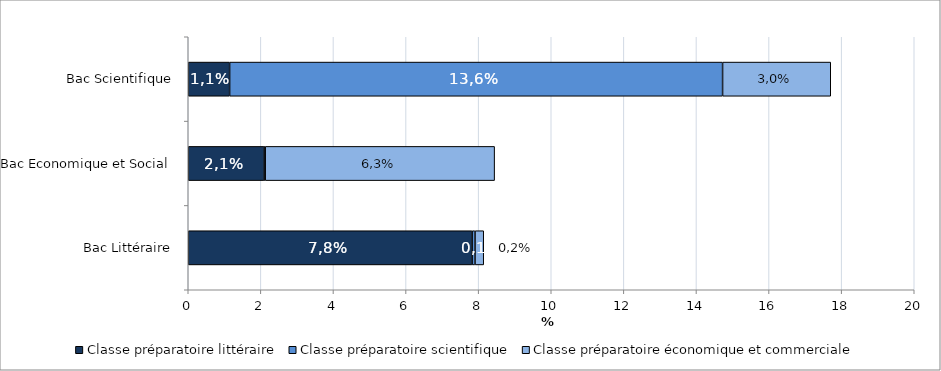
| Category | Classe préparatoire littéraire | Classe préparatoire scientifique | Classe préparatoire économique et commerciale |
|---|---|---|---|
| Bac Littéraire | 7.82 | 0.08 | 0.24 |
| Bac Economique et Social | 2.09 | 0.03 | 6.32 |
| Bac Scientifique | 1.14 | 13.58 | 2.98 |